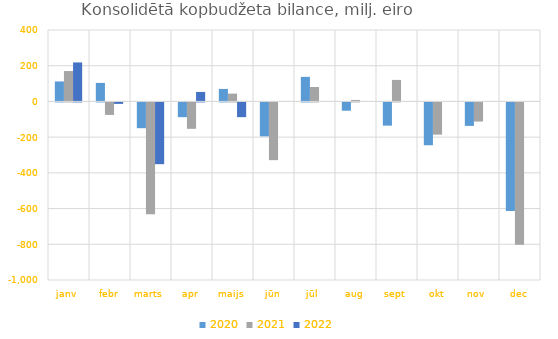
| Category | 2020 | 2021 | 2022 |
|---|---|---|---|
| janv | 111895.871 | 170157.398 | 218389.091 |
| febr | 103710.663 | -70037.902 | -8203.95 |
| marts | -144293.056 | -626307.766 | -345869.737 |
| apr | -82622.753 | -147810.305 | 53138.837 |
| maijs | 70036.276 | 43702.036 | -82553.768 |
| jūn | -190113.001 | -323251.437 | 0 |
| jūl | 137554.965 | 80650.706 | 0 |
| aug | -46323.774 | 8217.929 | 0 |
| sept | -129953.415 | 120460.062 | 0 |
| okt | -239787.453 | -180467.443 | 0 |
| nov | -131403.441 | -107114.455 | 0 |
| dec | -607594.717 | -796518.828 | 0 |